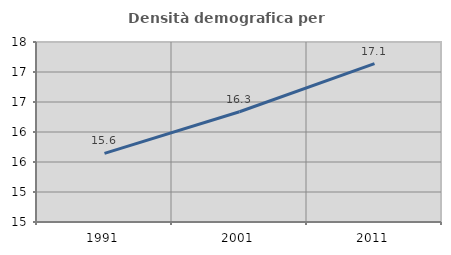
| Category | Densità demografica |
|---|---|
| 1991.0 | 15.643 |
| 2001.0 | 16.338 |
| 2011.0 | 17.138 |